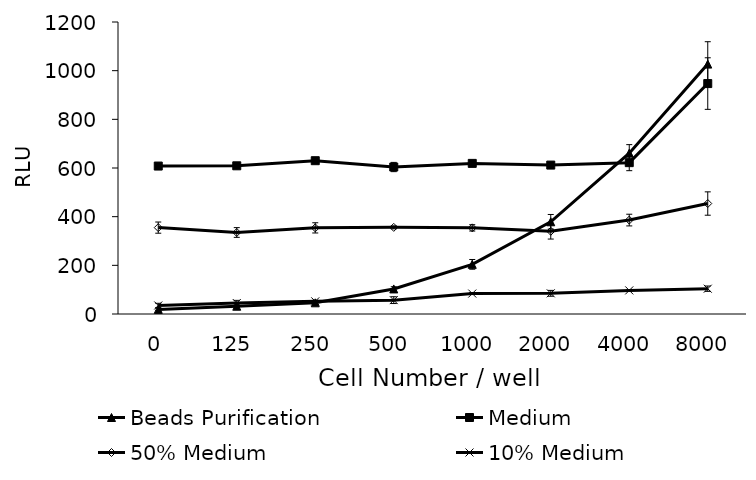
| Category | Beads Purification | Medium | 50% Medium | 10% Medium |
|---|---|---|---|---|
| 0.0 | 19 | 608 | 355 | 35 |
| 125.0 | 32 | 609 | 335 | 45 |
| 250.0 | 46 | 630 | 354 | 52 |
| 500.0 | 103 | 604 | 356 | 57 |
| 1000.0 | 204 | 619 | 354 | 84 |
| 2000.0 | 379 | 612 | 340 | 85 |
| 4000.0 | 661 | 622 | 386 | 97 |
| 8000.0 | 1027 | 947 | 454 | 104 |